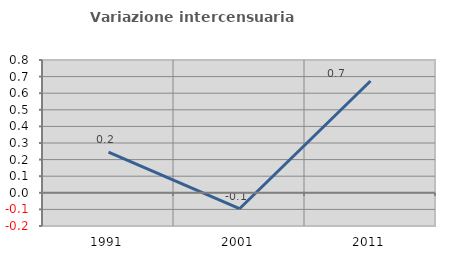
| Category | Variazione intercensuaria annua |
|---|---|
| 1991.0 | 0.245 |
| 2001.0 | -0.096 |
| 2011.0 | 0.674 |